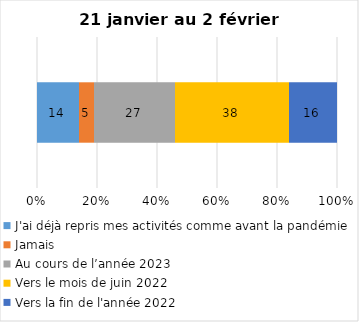
| Category | J'ai déjà repris mes activités comme avant la pandémie | Jamais | Au cours de l’année 2023 | Vers le mois de juin 2022 | Vers la fin de l'année 2022 |
|---|---|---|---|---|---|
| 0 | 14 | 5 | 27 | 38 | 16 |